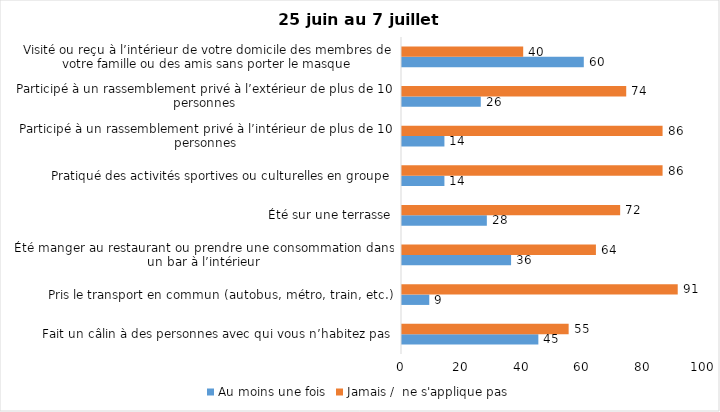
| Category | Au moins une fois | Jamais /  ne s'applique pas |
|---|---|---|
| Fait un câlin à des personnes avec qui vous n’habitez pas | 45 | 55 |
| Pris le transport en commun (autobus, métro, train, etc.) | 9 | 91 |
| Été manger au restaurant ou prendre une consommation dans un bar à l’intérieur | 36 | 64 |
| Été sur une terrasse | 28 | 72 |
| Pratiqué des activités sportives ou culturelles en groupe | 14 | 86 |
| Participé à un rassemblement privé à l’intérieur de plus de 10 personnes | 14 | 86 |
| Participé à un rassemblement privé à l’extérieur de plus de 10 personnes | 26 | 74 |
| Visité ou reçu à l’intérieur de votre domicile des membres de votre famille ou des amis sans porter le masque | 60 | 40 |